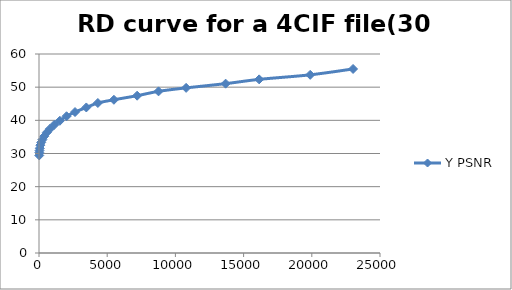
| Category | Y PSNR |
|---|---|
| 19.0 | 29.42 |
| 25.0 | 30.24 |
| 37.0 | 30.88 |
| 58.0 | 31.57 |
| 99.0 | 32.51 |
| 162.0 | 33.34 |
| 248.0 | 34.18 |
| 386.0 | 35.21 |
| 573.0 | 36.35 |
| 795.0 | 37.4 |
| 1117.0 | 38.63 |
| 1527.0 | 39.86 |
| 2019.0 | 41.23 |
| 2642.0 | 42.5 |
| 3468.0 | 43.88 |
| 4315.0 | 45.23 |
| 5492.0 | 46.2 |
| 7195.0 | 47.43 |
| 8764.0 | 48.74 |
| 10787.0 | 49.79 |
| 13683.0 | 51.06 |
| 16140.0 | 52.35 |
| 19882.0 | 53.72 |
| 23024.0 | 55.49 |